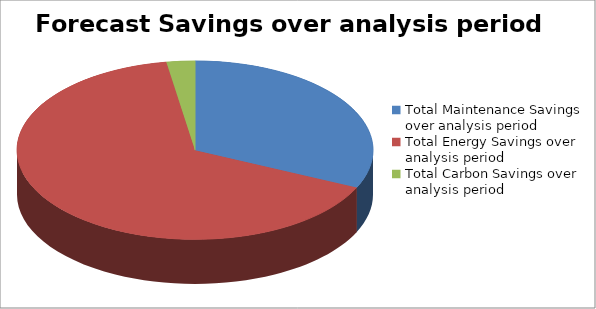
| Category | Forecast Savings |
|---|---|
| Total Maintenance Savings over analysis period | 3905756.656 |
| Total Energy Savings over analysis period | 8025113.707 |
| Total Carbon Savings over analysis period | 314744.978 |